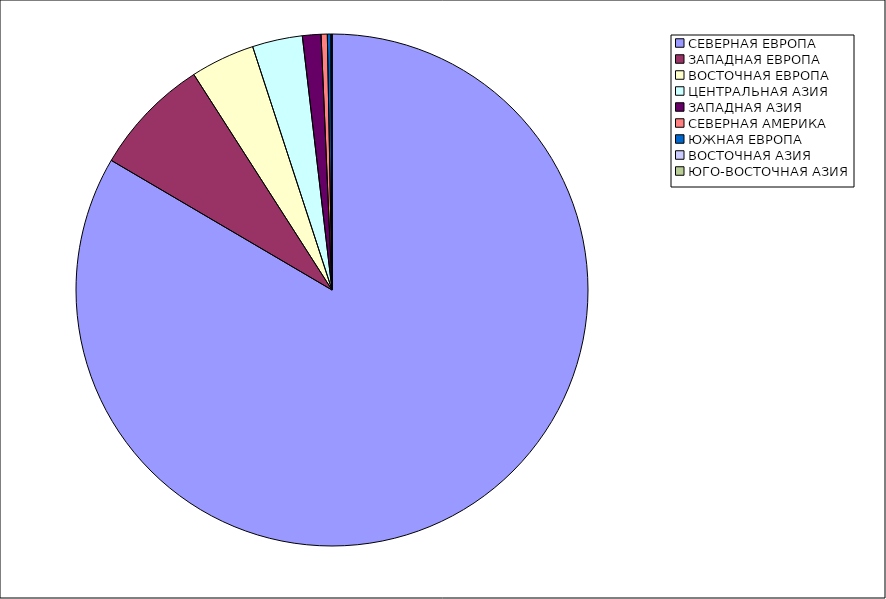
| Category | Оборот |
|---|---|
| СЕВЕРНАЯ ЕВРОПА | 83.449 |
| ЗАПАДНАЯ ЕВРОПА | 7.476 |
| ВОСТОЧНАЯ ЕВРОПА | 4.058 |
| ЦЕНТРАЛЬНАЯ АЗИЯ | 3.164 |
| ЗАПАДНАЯ АЗИЯ | 1.17 |
| СЕВЕРНАЯ АМЕРИКА | 0.392 |
| ЮЖНАЯ ЕВРОПА | 0.218 |
| ВОСТОЧНАЯ АЗИЯ | 0.072 |
| ЮГО-ВОСТОЧНАЯ АЗИЯ | 0 |